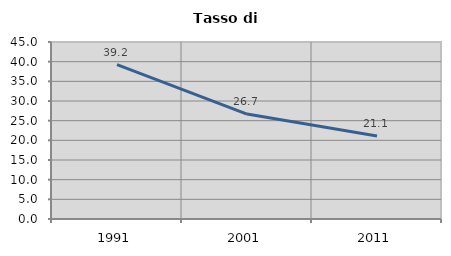
| Category | Tasso di disoccupazione   |
|---|---|
| 1991.0 | 39.225 |
| 2001.0 | 26.687 |
| 2011.0 | 21.084 |